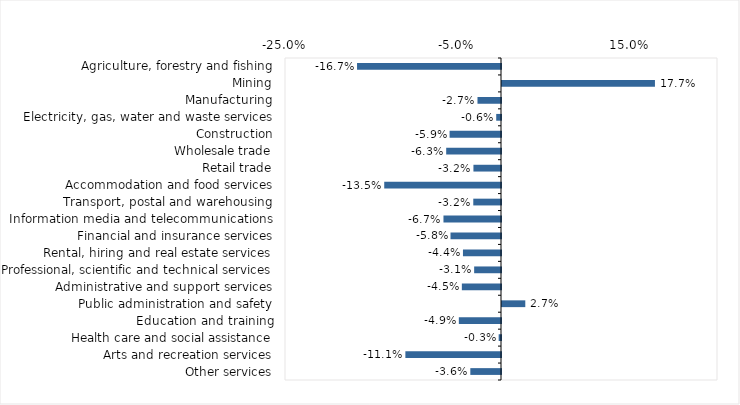
| Category | This week |
|---|---|
| Agriculture, forestry and fishing | -0.167 |
| Mining | 0.177 |
| Manufacturing | -0.027 |
| Electricity, gas, water and waste services | -0.006 |
| Construction | -0.059 |
| Wholesale trade | -0.063 |
| Retail trade | -0.032 |
| Accommodation and food services | -0.135 |
| Transport, postal and warehousing | -0.032 |
| Information media and telecommunications | -0.067 |
| Financial and insurance services | -0.058 |
| Rental, hiring and real estate services | -0.044 |
| Professional, scientific and technical services | -0.031 |
| Administrative and support services | -0.045 |
| Public administration and safety | 0.027 |
| Education and training | -0.049 |
| Health care and social assistance | -0.003 |
| Arts and recreation services | -0.111 |
| Other services | -0.036 |